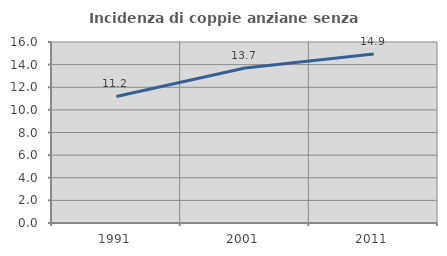
| Category | Incidenza di coppie anziane senza figli  |
|---|---|
| 1991.0 | 11.189 |
| 2001.0 | 13.694 |
| 2011.0 | 14.948 |